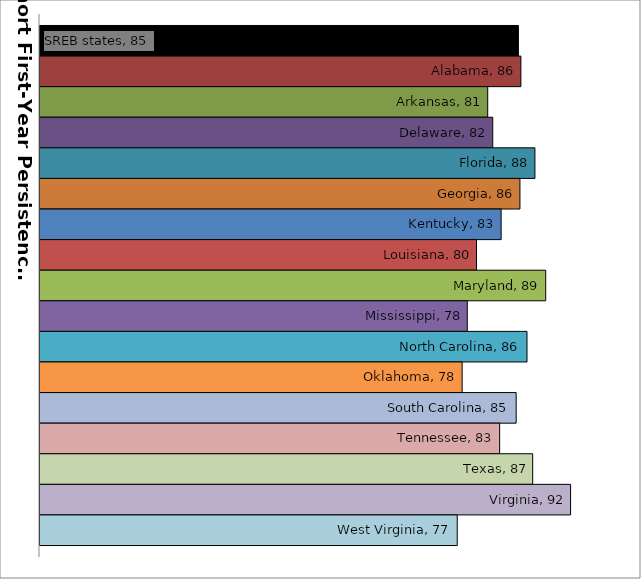
| Category | SREB states | Alabama | Arkansas | Delaware | Florida | Georgia | Kentucky | Louisiana | Maryland | Mississippi | North Carolina | Oklahoma | South Carolina | Tennessee | Texas | Virginia | West Virginia |
|---|---|---|---|---|---|---|---|---|---|---|---|---|---|---|---|---|---|
| 0 | 85.311 | 85.649 | 81.122 | 81.808 | 87.567 | 85.522 | 82.952 | 79.591 | 89.042 | 78.333 | 86.485 | 77.629 | 85.005 | 82.752 | 87.261 | 92.434 | 76.961 |